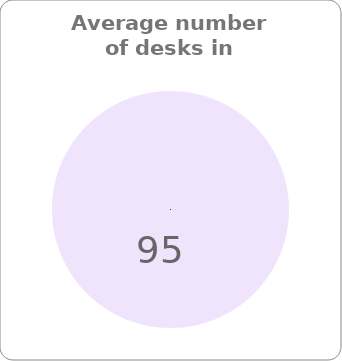
| Category | Series 0 |
|---|---|
| 0 | 95 |